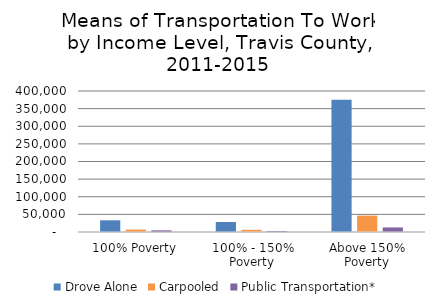
| Category | Drove Alone | Carpooled | Public Transportation* |
|---|---|---|---|
| 100% Poverty | 33153.556 | 6917.892 | 4766.112 |
| 100% - 150% Poverty | 28355.015 | 6261.885 | 2729.312 |
| Above 150% Poverty | 375158.66 | 46457.223 | 12872.576 |